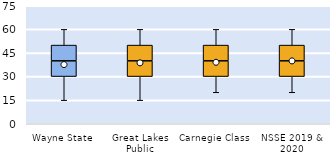
| Category | 25th | 50th | 75th |
|---|---|---|---|
| Wayne State | 30 | 10 | 10 |
| Great Lakes Public | 30 | 10 | 10 |
| Carnegie Class | 30 | 10 | 10 |
| NSSE 2019 & 2020 | 30 | 10 | 10 |